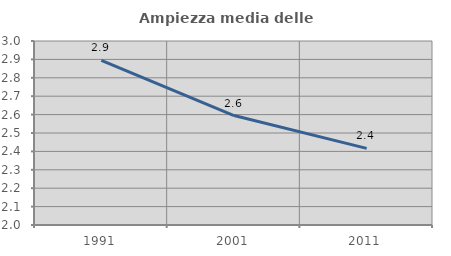
| Category | Ampiezza media delle famiglie |
|---|---|
| 1991.0 | 2.895 |
| 2001.0 | 2.595 |
| 2011.0 | 2.417 |